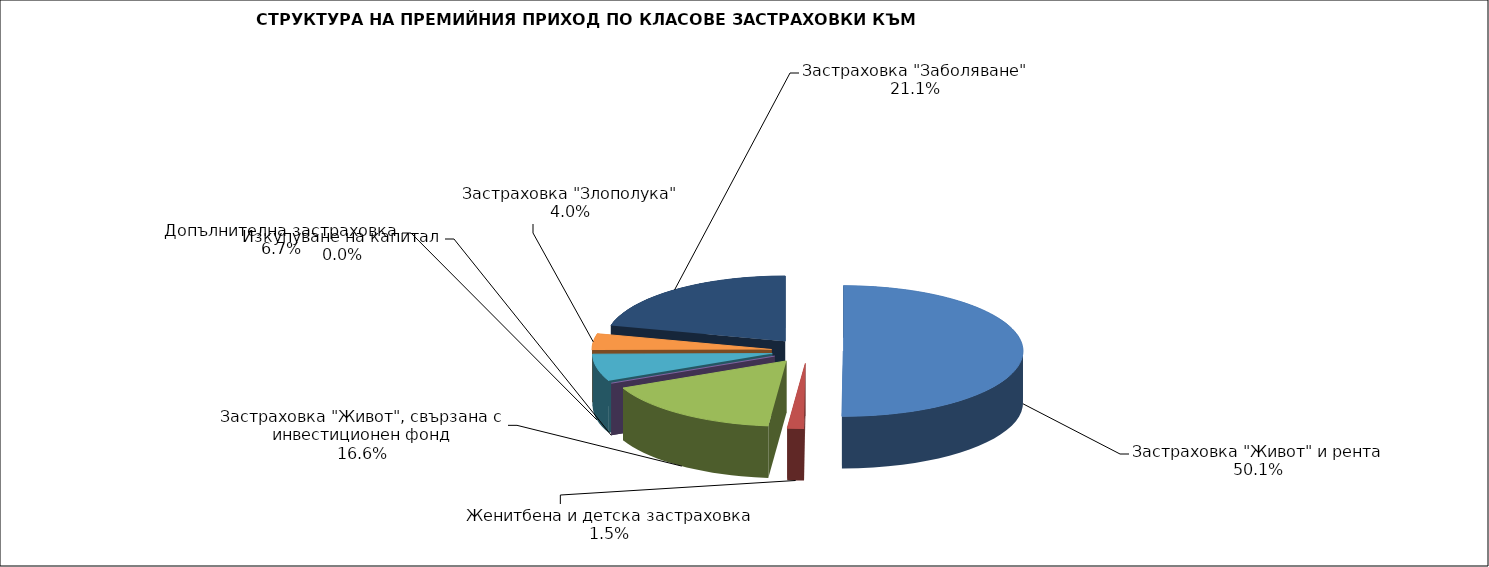
| Category | Series 0 |
|---|---|
| Застраховка "Живот" и рента | 45948332.502 |
| Женитбена и детска застраховка | 1366456.746 |
| Застраховка "Живот", свързана с инвестиционен фонд | 15187726.128 |
| Изкупуване на капитал | 0 |
| Допълнителна застраховка | 6129112.694 |
| Застраховка "Злополука" | 3689981.78 |
| Застраховка "Заболяване" | 19356458.47 |